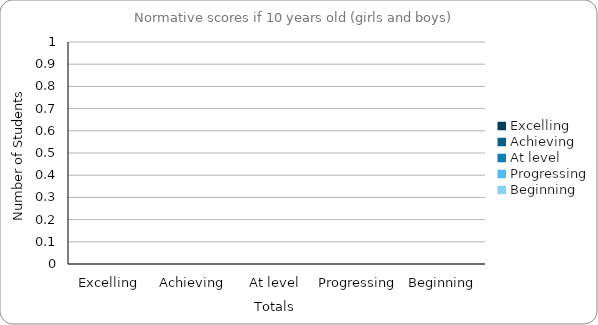
| Category | If 10 Years Old |
|---|---|
| Excelling | 0 |
| Achieving | 0 |
| At level | 0 |
| Progressing | 0 |
| Beginning | 0 |